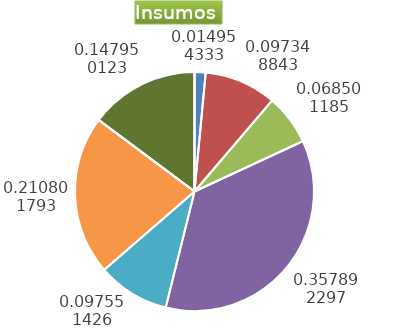
| Category | Series 0 |
|---|---|
| Control arvenses | 3299850 |
| Control fitosanitario | 21481170 |
| Cosecha y beneficio | 15115594.114 |
| Fertilización | 78973155 |
| Instalación | 21525872.246 |
| Otros | 47619210 |
| Podas | 0 |
| Riego | 0 |
| Transporte | 32646939 |
| Tutorado | 0 |